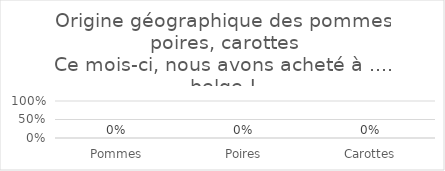
| Category | Series 0 |
|---|---|
| Pommes | 0 |
| Poires | 0 |
| Carottes | 0 |